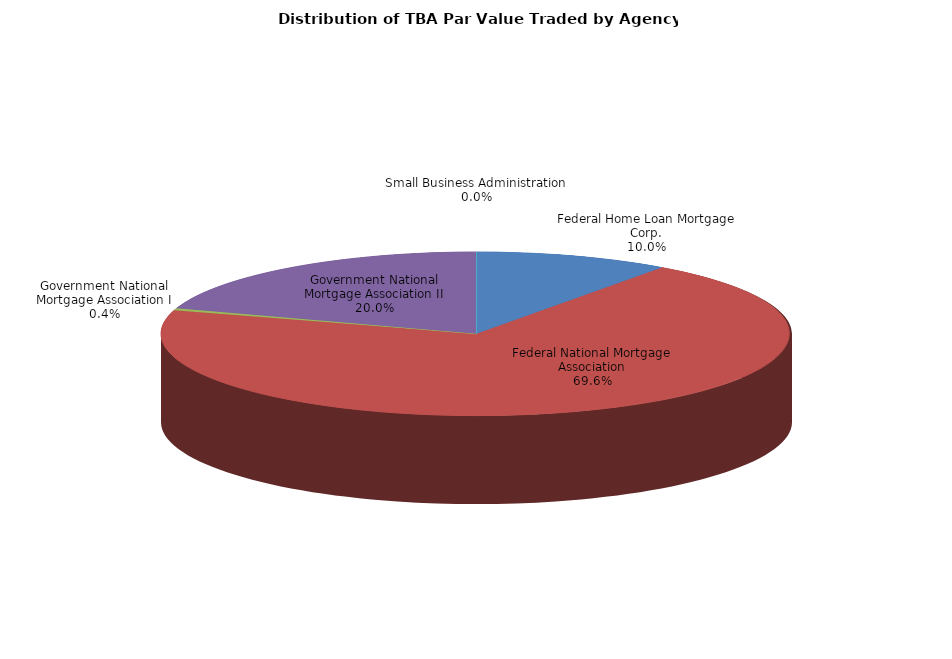
| Category | Series 0 |
|---|---|
| Federal Home Loan Mortgage Corp. | 20410129965.076 |
| Federal National Mortgage Association | 142132124737.422 |
| Government National Mortgage Association I | 809537700.534 |
| Government National Mortgage Association II | 40762940917.629 |
| Small Business Administration | 0 |